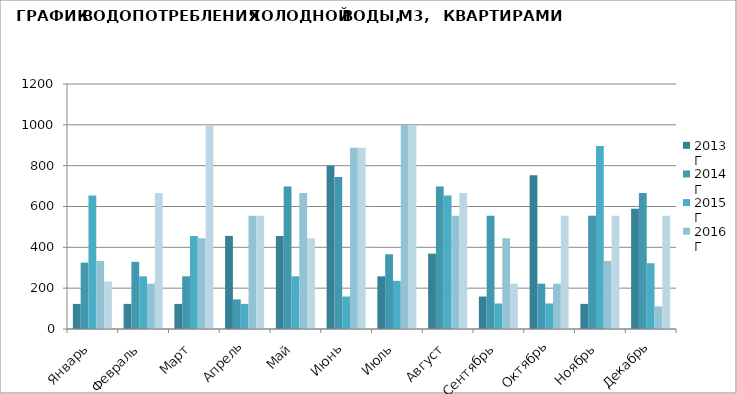
| Category | 2013 Г | 2014 Г | 2015 Г | 2016 Г | 2017 Г |
|---|---|---|---|---|---|
| Январь  | 123 | 325 | 654 | 333 | 233 |
| Февраль  | 123 | 329 | 258 | 222 | 666 |
| Март | 123 | 258 | 456 | 444 | 999 |
| Апрель | 456 | 145 | 123 | 555 | 555 |
| Май | 456 | 698 | 258 | 666 | 444 |
| Июнь | 799 | 745 | 159 | 888 | 888 |
| Июль | 258 | 366 | 236 | 999 | 999 |
| Август | 369 | 698 | 654 | 555 | 666 |
| Сентябрь | 159 | 555 | 125 | 444 | 222 |
| Октябрь | 753 | 222 | 125 | 222 | 555 |
| Ноябрь | 123 | 555 | 896 | 333 | 555 |
| Декабрь | 589 | 666 | 322 | 111 | 555 |